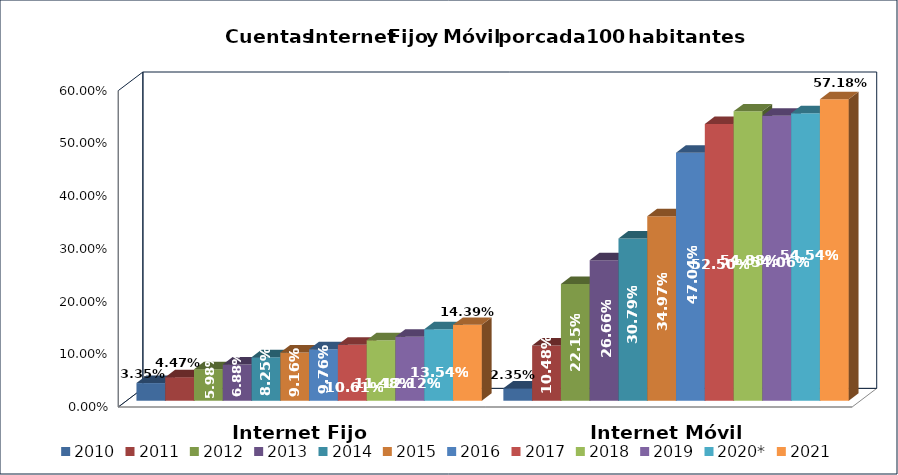
| Category | 2010 | 2011 | 2012 | 2013 | 2014 | 2015 | 2016 | 2017 | 2018 | 2019 | 2020* | 2021 |
|---|---|---|---|---|---|---|---|---|---|---|---|---|
| Internet Fijo | 0.033 | 0.045 | 0.06 | 0.069 | 0.083 | 0.092 | 0.098 | 0.106 | 0.115 | 0.121 | 0.135 | 0.144 |
| Internet Móvil | 0.024 | 0.105 | 0.222 | 0.267 | 0.308 | 0.35 | 0.47 | 0.525 | 0.549 | 0.541 | 0.545 | 0.572 |